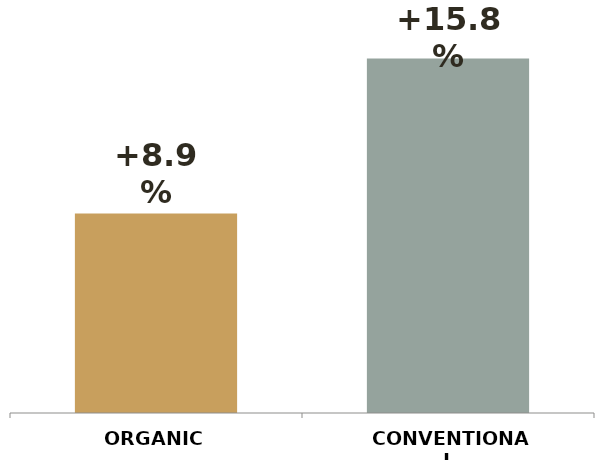
| Category | Series 0 |
|---|---|
| ORGANIC | 0.089 |
| CONVENTIONAL | 0.158 |